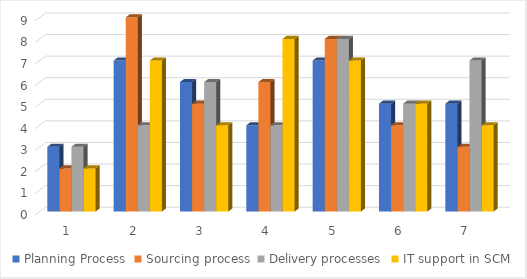
| Category | Planning Process | Sourcing process | Delivery processes | IT support in SCM |
|---|---|---|---|---|
| 1.0 | 3 | 2 | 3 | 2 |
| 2.0 | 7 | 9 | 4 | 7 |
| 3.0 | 6 | 5 | 6 | 4 |
| 4.0 | 4 | 6 | 4 | 8 |
| 5.0 | 7 | 8 | 8 | 7 |
| 6.0 | 5 | 4 | 5 | 5 |
| 7.0 | 5 | 3 | 7 | 4 |